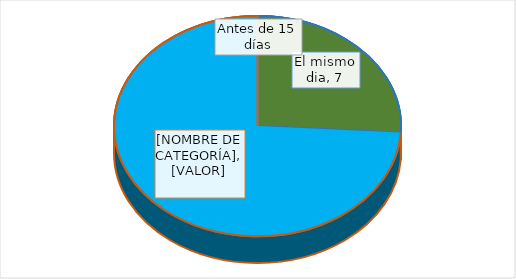
| Category | Series 0 |
|---|---|
| El mismo dia | 7 |
| Antes de 9 días | 20 |
| Antes de 15 días | 0 |